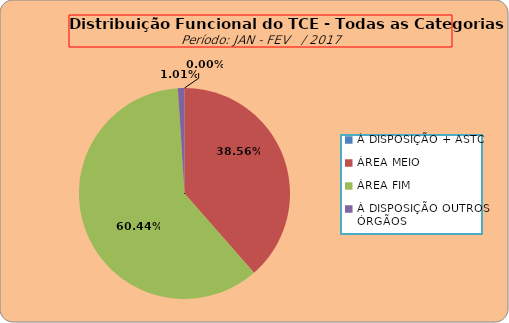
| Category | Series 0 |
|---|---|
| À DISPOSIÇÃO + ASTC | 0 |
| ÁREA MEIO | 192 |
| ÁREA FIM | 301 |
| À DISPOSIÇÃO OUTROS ÓRGÃOS | 5 |